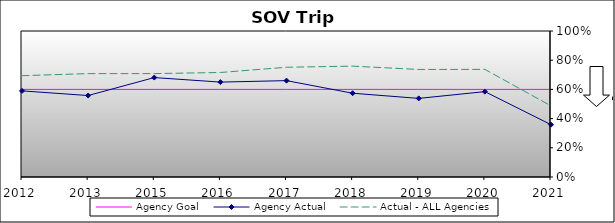
| Category | Agency Goal | Agency Actual | Actual - ALL Agencies |
|---|---|---|---|
| 2012.0 | 0.6 | 0.59 | 0.694 |
| 2013.0 | 0.6 | 0.558 | 0.708 |
| 2015.0 | 0.6 | 0.681 | 0.708 |
| 2016.0 | 0.6 | 0.65 | 0.716 |
| 2017.0 | 0.6 | 0.66 | 0.752 |
| 2018.0 | 0.6 | 0.574 | 0.759 |
| 2019.0 | 0.6 | 0.538 | 0.736 |
| 2020.0 | 0.6 | 0.585 | 0.737 |
| 2021.0 | 0.6 | 0.358 | 0.487 |